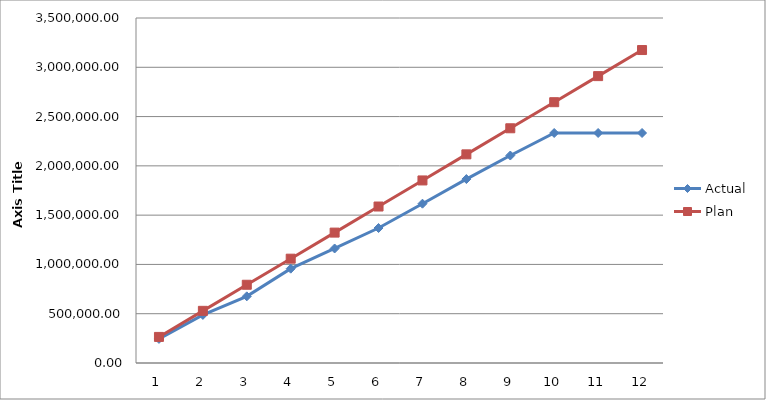
| Category | Actual | Plan |
|---|---|---|
| 0 | 244369.04 | 264583.333 |
| 1 | 487948.56 | 529166.667 |
| 2 | 676367.65 | 793750 |
| 3 | 956886.88 | 1058333.333 |
| 4 | 1161719.22 | 1322916.667 |
| 5 | 1369452.09 | 1587500 |
| 6 | 1616060.3 | 1852083.333 |
| 7 | 1865754.88 | 2116666.667 |
| 8 | 2104792.89 | 2381250 |
| 9 | 2333346.86 | 2645833.333 |
| 10 | 2333346.86 | 2910416.667 |
| 11 | 2333346.86 | 3175000 |